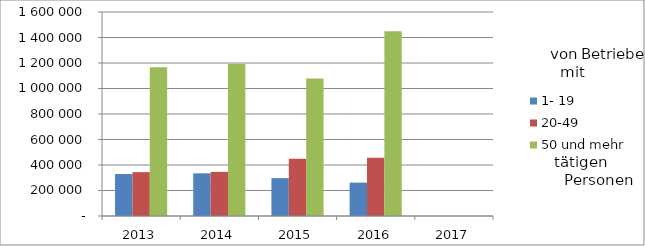
| Category | 1- 19 | 20-49 | 50 und mehr |
|---|---|---|---|
| 2013.0 | 329108.086 | 344040.657 | 1167298.078 |
| 2014.0 | 334848.153 | 346160.396 | 1192631.258 |
| 2015.0 | 297116.655 | 448998.512 | 1078892.853 |
| 2016.0 | 261822.605 | 456254.347 | 1449929.516 |
| 2017.0 | 0 | 0 | 0 |